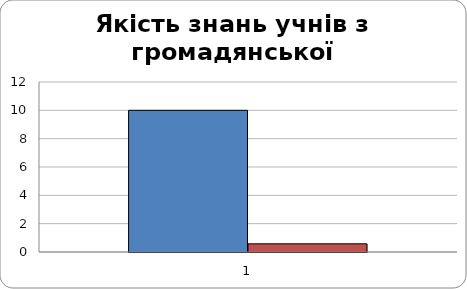
| Category | Series 0 | Series 1 |
|---|---|---|
| 0 | 10 | 0.577 |